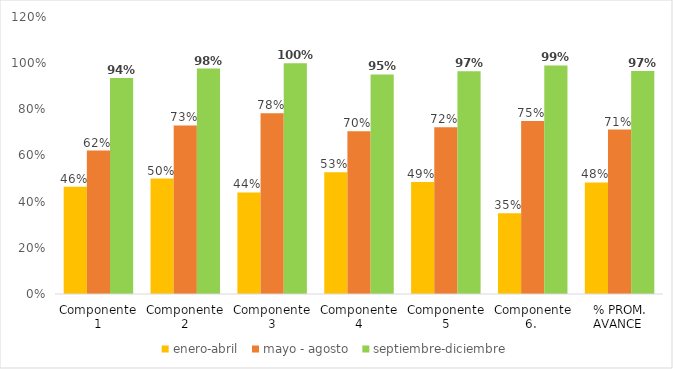
| Category | enero-abril  | mayo - agosto  | septiembre-diciembre |
|---|---|---|---|
| Componente 1 | 0.464 | 0.621 | 0.936 |
| Componente 2 | 0.5 | 0.73 | 0.977 |
| Componente 3 | 0.44 | 0.783 | 1 |
| Componente 4 | 0.527 | 0.705 | 0.951 |
| Componente 5 | 0.485 | 0.722 | 0.965 |
| Componente 6.  | 0.35 | 0.75 | 0.99 |
| % PROM. AVANCE  | 0.483 | 0.712 | 0.966 |